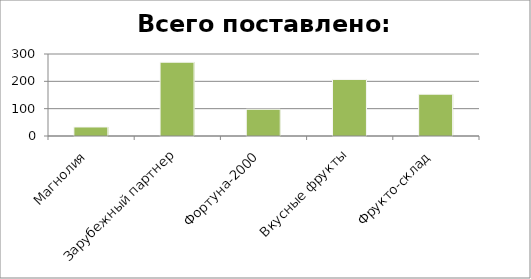
| Category | Общее количество |
|---|---|
| Магнолия | 33 |
| Зарубежный партнер | 270 |
| Фортуна-2000 | 98 |
| Вкусные фрукты | 207 |
| Фрукто-склад | 153 |